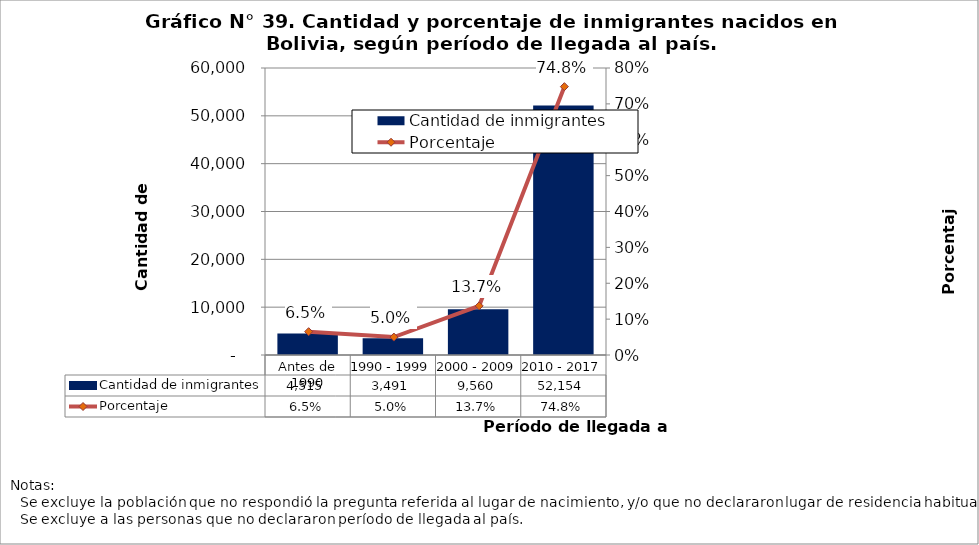
| Category | Cantidad de inmigrantes |
|---|---|
| Antes de 1990 | 4515 |
| 1990 - 1999 | 3491 |
| 2000 - 2009 | 9560 |
| 2010 - 2017 | 52154 |